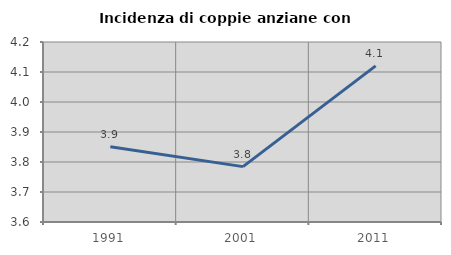
| Category | Incidenza di coppie anziane con figli |
|---|---|
| 1991.0 | 3.851 |
| 2001.0 | 3.785 |
| 2011.0 | 4.12 |